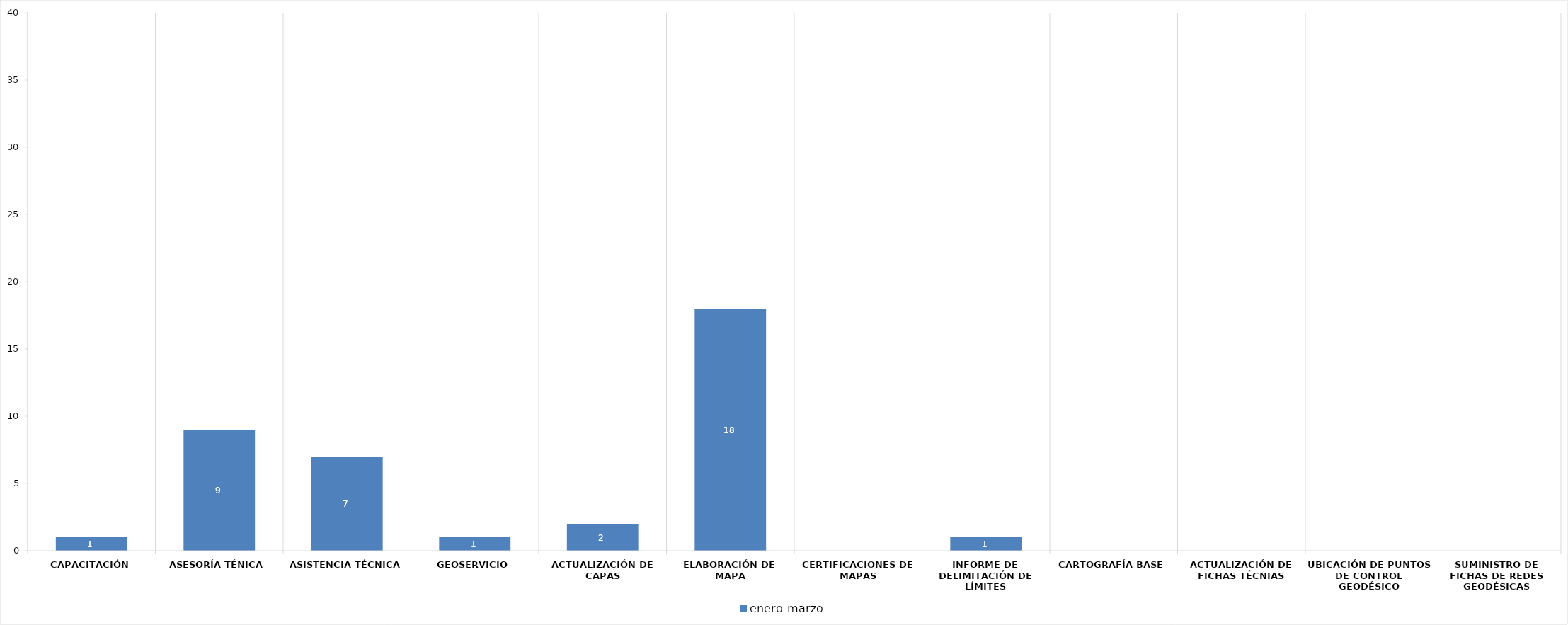
| Category | enero-marzo | Series 1 |
|---|---|---|
| Capacitación | 1 |  |
| Asesoría ténica | 9 |  |
| Asistencia técnica | 7 |  |
| Geoservicio | 1 |  |
| Actualización de capas | 2 |  |
| Elaboración de mapa | 18 |  |
| Certificaciones de mapas | 0 |  |
| Informe de delimitación de límites | 1 |  |
| Cartografía base | 0 |  |
| Actualización de fichas técnias | 0 |  |
| Ubicación de puntos de control geodésico | 0 |  |
| Suministro de fichas de redes geodésicas | 0 |  |